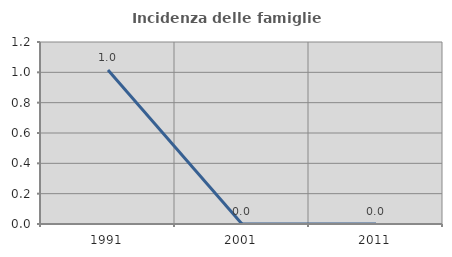
| Category | Incidenza delle famiglie numerose |
|---|---|
| 1991.0 | 1.015 |
| 2001.0 | 0 |
| 2011.0 | 0 |